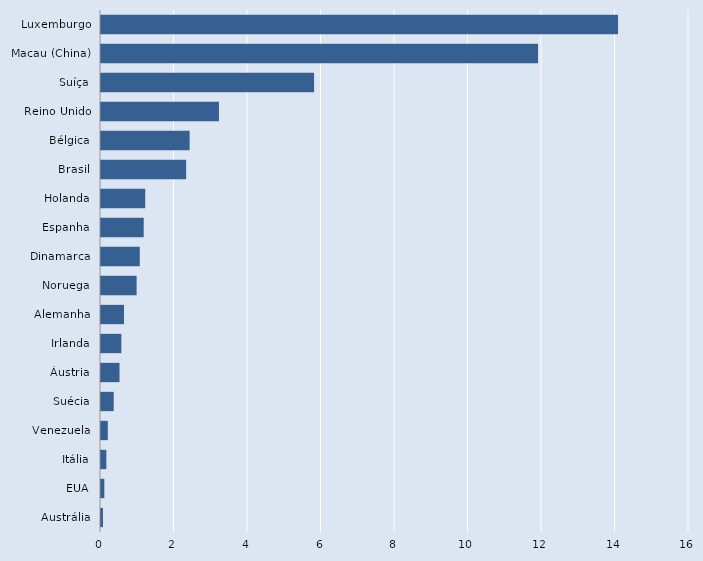
| Category | Series 0 |
|---|---|
| Austrália | 0.053 |
| EUA | 0.091 |
| Itália | 0.146 |
| Venezuela | 0.185 |
| Suécia | 0.346 |
| Áustria | 0.504 |
| Irlanda | 0.554 |
| Alemanha | 0.626 |
| Noruega | 0.969 |
| Dinamarca | 1.055 |
| Espanha | 1.162 |
| Holanda | 1.204 |
| Brasil | 2.317 |
| Bélgica | 2.412 |
| Reino Unido | 3.21 |
| Suíça | 5.798 |
| Macau (China) | 11.892 |
| Luxemburgo | 14.069 |